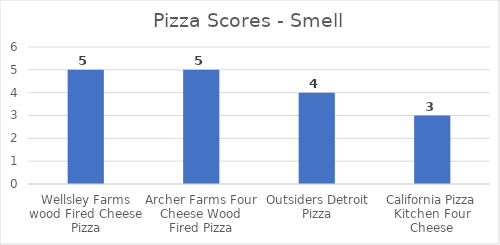
| Category | Series 0 |
|---|---|
| Wellsley Farms wood Fired Cheese Pizza | 5 |
| Archer Farms Four Cheese Wood Fired Pizza | 5 |
| Outsiders Detroit Pizza | 4 |
| California Pizza Kitchen Four Cheese | 3 |